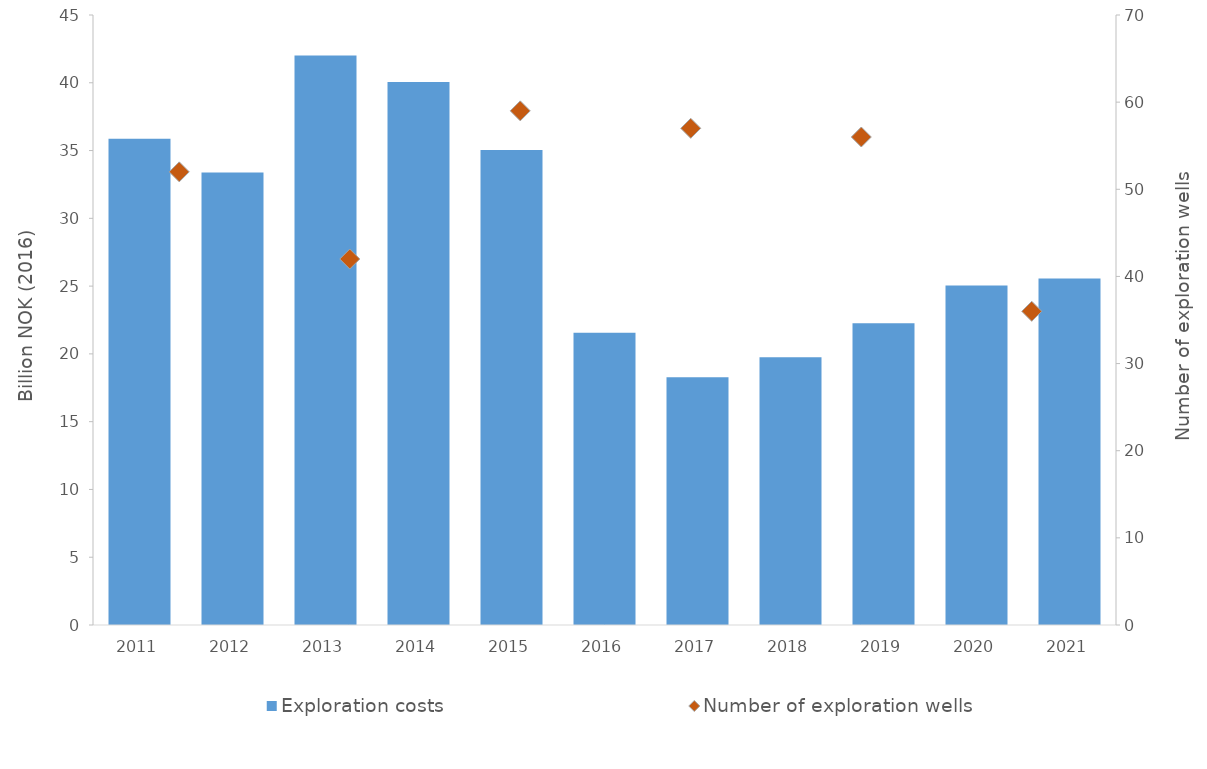
| Category | Exploration costs |
|---|---|
| 2011.0 | 35.87 |
| 2012.0 | 33.381 |
| 2013.0 | 42.013 |
| 2014.0 | 40.06 |
| 2015.0 | 35.049 |
| 2016.0 | 21.555 |
| 2017.0 | 18.285 |
| 2018.0 | 19.754 |
| 2019.0 | 22.259 |
| 2020.0 | 25.042 |
| 2021.0 | 25.554 |